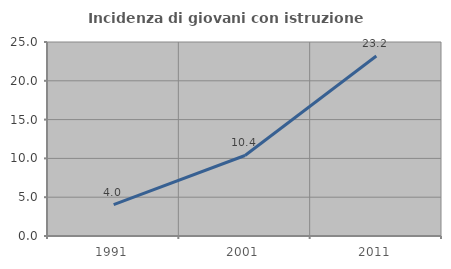
| Category | Incidenza di giovani con istruzione universitaria |
|---|---|
| 1991.0 | 4.04 |
| 2001.0 | 10.377 |
| 2011.0 | 23.2 |